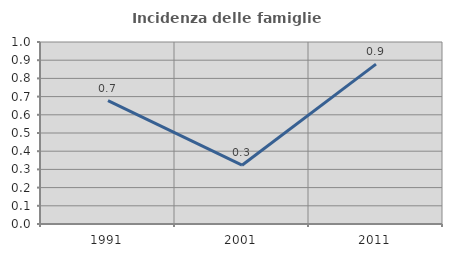
| Category | Incidenza delle famiglie numerose |
|---|---|
| 1991.0 | 0.678 |
| 2001.0 | 0.323 |
| 2011.0 | 0.878 |